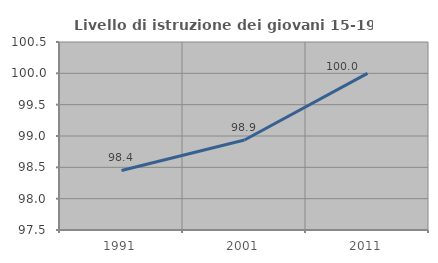
| Category | Livello di istruzione dei giovani 15-19 anni |
|---|---|
| 1991.0 | 98.45 |
| 2001.0 | 98.936 |
| 2011.0 | 100 |